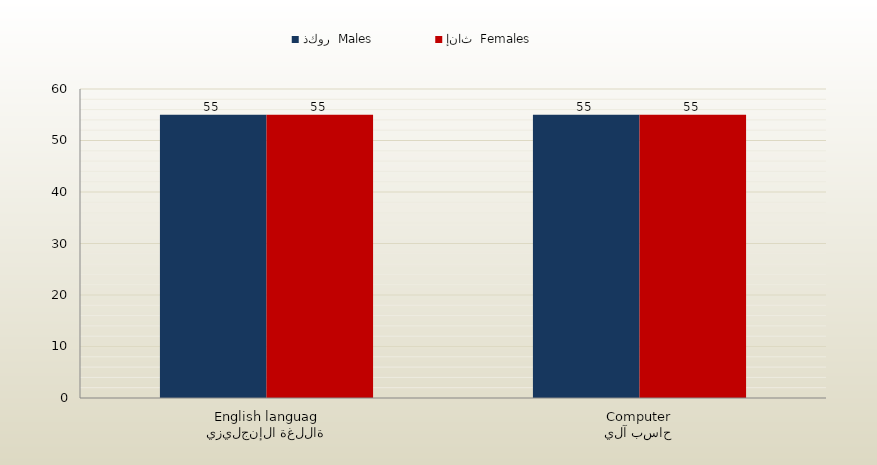
| Category | ذكور  Males | إناث  Females |
|---|---|---|
| اللغة الإنجليزية
English language | 55 | 55 |
| حاسب آلي
Computer | 55 | 55 |